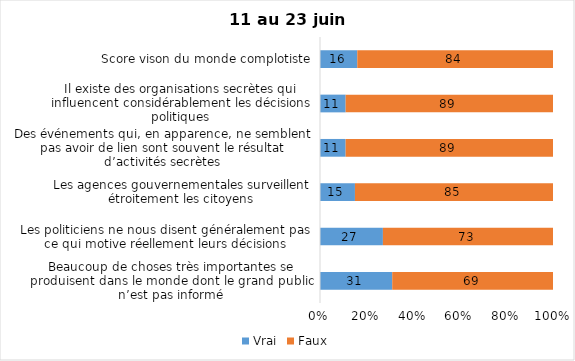
| Category | Vrai | Faux |
|---|---|---|
| Beaucoup de choses très importantes se produisent dans le monde dont le grand public n’est pas informé | 31 | 69 |
| Les politiciens ne nous disent généralement pas ce qui motive réellement leurs décisions | 27 | 73 |
| Les agences gouvernementales surveillent étroitement les citoyens | 15 | 85 |
| Des événements qui, en apparence, ne semblent pas avoir de lien sont souvent le résultat d’activités secrètes | 11 | 89 |
| Il existe des organisations secrètes qui influencent considérablement les décisions politiques | 11 | 89 |
| Score vison du monde complotiste | 16 | 84 |